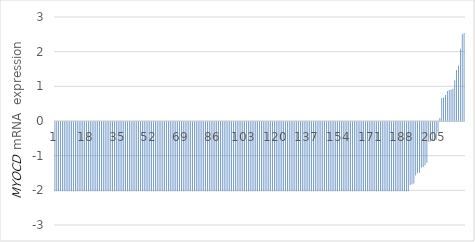
| Category | Series 0 |
|---|---|
| 0 | -2 |
| 1 | -2 |
| 2 | -2 |
| 3 | -2 |
| 4 | -2 |
| 5 | -2 |
| 6 | -2 |
| 7 | -2 |
| 8 | -2 |
| 9 | -2 |
| 10 | -2 |
| 11 | -2 |
| 12 | -2 |
| 13 | -2 |
| 14 | -2 |
| 15 | -2 |
| 16 | -2 |
| 17 | -2 |
| 18 | -2 |
| 19 | -2 |
| 20 | -2 |
| 21 | -2 |
| 22 | -2 |
| 23 | -2 |
| 24 | -2 |
| 25 | -2 |
| 26 | -2 |
| 27 | -2 |
| 28 | -2 |
| 29 | -2 |
| 30 | -2 |
| 31 | -2 |
| 32 | -2 |
| 33 | -2 |
| 34 | -2 |
| 35 | -2 |
| 36 | -2 |
| 37 | -2 |
| 38 | -2 |
| 39 | -2 |
| 40 | -2 |
| 41 | -2 |
| 42 | -2 |
| 43 | -2 |
| 44 | -2 |
| 45 | -2 |
| 46 | -2 |
| 47 | -2 |
| 48 | -2 |
| 49 | -2 |
| 50 | -2 |
| 51 | -2 |
| 52 | -2 |
| 53 | -2 |
| 54 | -2 |
| 55 | -2 |
| 56 | -2 |
| 57 | -2 |
| 58 | -2 |
| 59 | -2 |
| 60 | -2 |
| 61 | -2 |
| 62 | -2 |
| 63 | -2 |
| 64 | -2 |
| 65 | -2 |
| 66 | -2 |
| 67 | -2 |
| 68 | -2 |
| 69 | -2 |
| 70 | -2 |
| 71 | -2 |
| 72 | -2 |
| 73 | -2 |
| 74 | -2 |
| 75 | -2 |
| 76 | -2 |
| 77 | -2 |
| 78 | -2 |
| 79 | -2 |
| 80 | -2 |
| 81 | -2 |
| 82 | -2 |
| 83 | -2 |
| 84 | -2 |
| 85 | -2 |
| 86 | -2 |
| 87 | -2 |
| 88 | -2 |
| 89 | -2 |
| 90 | -2 |
| 91 | -2 |
| 92 | -2 |
| 93 | -2 |
| 94 | -2 |
| 95 | -2 |
| 96 | -2 |
| 97 | -2 |
| 98 | -2 |
| 99 | -2 |
| 100 | -2 |
| 101 | -2 |
| 102 | -2 |
| 103 | -2 |
| 104 | -2 |
| 105 | -2 |
| 106 | -2 |
| 107 | -2 |
| 108 | -2 |
| 109 | -2 |
| 110 | -2 |
| 111 | -2 |
| 112 | -2 |
| 113 | -2 |
| 114 | -2 |
| 115 | -2 |
| 116 | -2 |
| 117 | -2 |
| 118 | -2 |
| 119 | -2 |
| 120 | -2 |
| 121 | -2 |
| 122 | -2 |
| 123 | -2 |
| 124 | -2 |
| 125 | -2 |
| 126 | -2 |
| 127 | -2 |
| 128 | -2 |
| 129 | -2 |
| 130 | -2 |
| 131 | -2 |
| 132 | -2 |
| 133 | -2 |
| 134 | -2 |
| 135 | -2 |
| 136 | -2 |
| 137 | -2 |
| 138 | -2 |
| 139 | -2 |
| 140 | -2 |
| 141 | -2 |
| 142 | -2 |
| 143 | -2 |
| 144 | -2 |
| 145 | -2 |
| 146 | -2 |
| 147 | -2 |
| 148 | -2 |
| 149 | -2 |
| 150 | -2 |
| 151 | -2 |
| 152 | -2 |
| 153 | -2 |
| 154 | -2 |
| 155 | -2 |
| 156 | -2 |
| 157 | -2 |
| 158 | -2 |
| 159 | -2 |
| 160 | -2 |
| 161 | -2 |
| 162 | -2 |
| 163 | -2 |
| 164 | -2 |
| 165 | -2 |
| 166 | -2 |
| 167 | -2 |
| 168 | -2 |
| 169 | -2 |
| 170 | -2 |
| 171 | -2 |
| 172 | -2 |
| 173 | -2 |
| 174 | -2 |
| 175 | -2 |
| 176 | -2 |
| 177 | -2 |
| 178 | -2 |
| 179 | -2 |
| 180 | -2 |
| 181 | -2 |
| 182 | -2 |
| 183 | -2 |
| 184 | -2 |
| 185 | -2 |
| 186 | -2 |
| 187 | -2 |
| 188 | -2 |
| 189 | -2 |
| 190 | -2 |
| 191 | -1.816 |
| 192 | -1.794 |
| 193 | -1.775 |
| 194 | -1.542 |
| 195 | -1.477 |
| 196 | -1.461 |
| 197 | -1.309 |
| 198 | -1.295 |
| 199 | -1.248 |
| 200 | -1.177 |
| 201 | -0.571 |
| 202 | -0.565 |
| 203 | -0.547 |
| 204 | -0.542 |
| 205 | -0.509 |
| 206 | -0.294 |
| 207 | 0.086 |
| 208 | 0.666 |
| 209 | 0.676 |
| 210 | 0.752 |
| 211 | 0.867 |
| 212 | 0.894 |
| 213 | 0.899 |
| 214 | 0.933 |
| 215 | 1.174 |
| 216 | 1.468 |
| 217 | 1.6 |
| 218 | 2.082 |
| 219 | 2.504 |
| 220 | 2.538 |